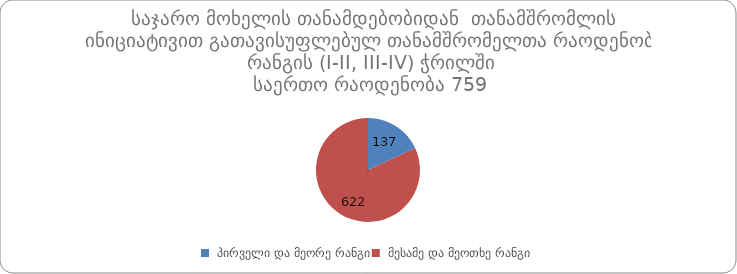
| Category | Series 0 |
|---|---|
|  პირველი და მეორე რანგი | 137 |
|  მესამე და მეოთხე რანგი | 622 |